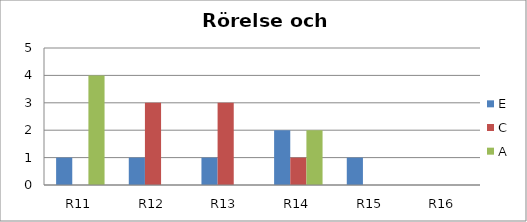
| Category | E | C | A |
|---|---|---|---|
| R11 | 1 | 0 | 4 |
| R12 | 1 | 3 | 0 |
| R13 | 1 | 3 | 0 |
| R14 | 2 | 1 | 2 |
| R15 | 1 | 0 | 0 |
| R16 | 0 | 0 | 0 |